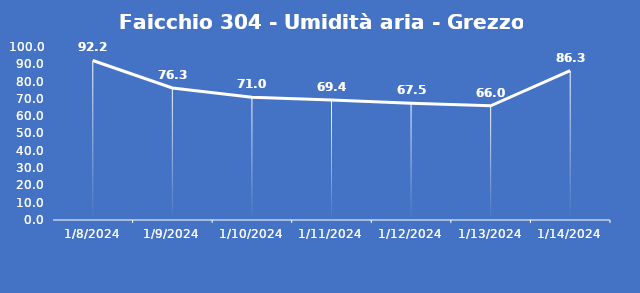
| Category | Faicchio 304 - Umidità aria - Grezzo (%) |
|---|---|
| 1/8/24 | 92.2 |
| 1/9/24 | 76.3 |
| 1/10/24 | 71 |
| 1/11/24 | 69.4 |
| 1/12/24 | 67.5 |
| 1/13/24 | 66 |
| 1/14/24 | 86.3 |